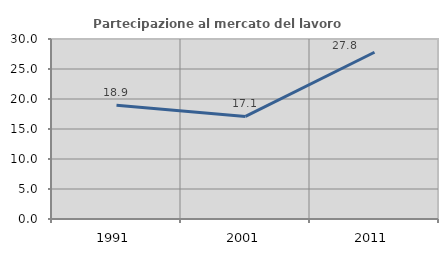
| Category | Partecipazione al mercato del lavoro  femminile |
|---|---|
| 1991.0 | 18.941 |
| 2001.0 | 17.102 |
| 2011.0 | 27.789 |